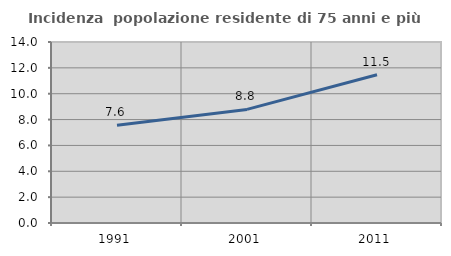
| Category | Incidenza  popolazione residente di 75 anni e più |
|---|---|
| 1991.0 | 7.559 |
| 2001.0 | 8.787 |
| 2011.0 | 11.47 |